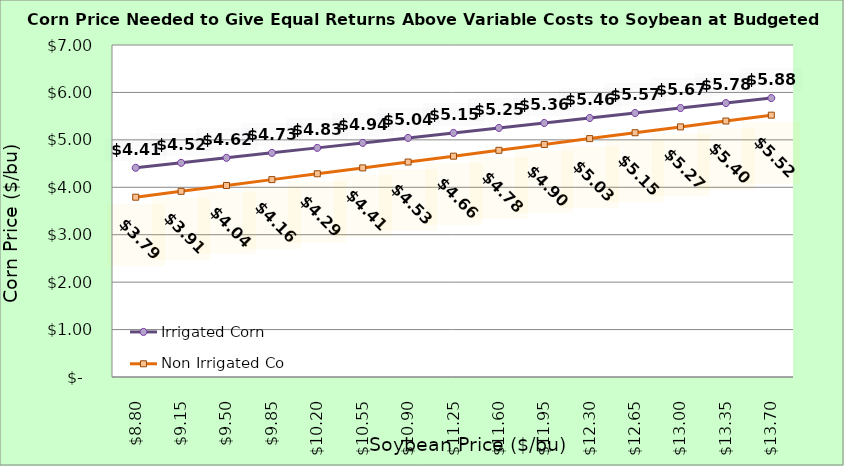
| Category | Irrigated Corn | Non Irrigated Corn |
|---|---|---|
| 8.800000000000002 | 4.411 | 3.791 |
| 9.150000000000002 | 4.516 | 3.915 |
| 9.500000000000002 | 4.621 | 4.038 |
| 9.850000000000001 | 4.726 | 4.162 |
| 10.200000000000001 | 4.831 | 4.285 |
| 10.55 | 4.936 | 4.409 |
| 10.9 | 5.041 | 4.532 |
| 11.25 | 5.146 | 4.656 |
| 11.6 | 5.251 | 4.779 |
| 11.95 | 5.356 | 4.903 |
| 12.299999999999999 | 5.461 | 5.026 |
| 12.649999999999999 | 5.566 | 5.15 |
| 12.999999999999998 | 5.671 | 5.273 |
| 13.349999999999998 | 5.776 | 5.397 |
| 13.699999999999998 | 5.881 | 5.52 |